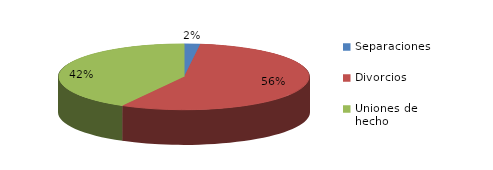
| Category | Series 0 |
|---|---|
| Separaciones | 14 |
| Divorcios | 384 |
| Uniones de hecho | 287 |